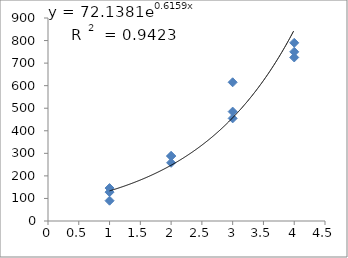
| Category | Series 0 |
|---|---|
| 1.0 | 146 |
| 1.0 | 128 |
| 1.0 | 90 |
| 2.0 | 288 |
| 2.0 | 258 |
| 2.0 | 288 |
| 3.0 | 615 |
| 3.0 | 455 |
| 3.0 | 485 |
| 4.0 | 750 |
| 4.0 | 790 |
| 4.0 | 725 |